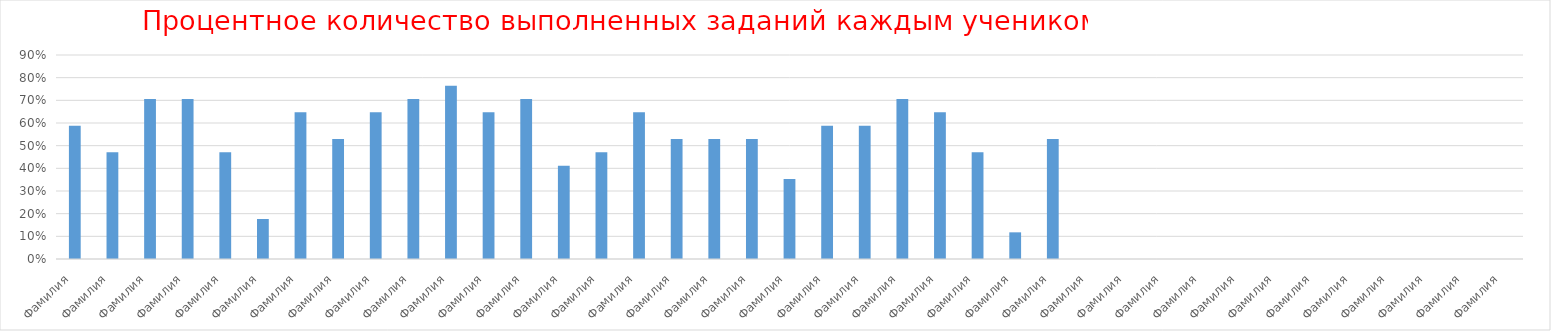
| Category | Series 0 |
|---|---|
| Фамилия  | 0.588 |
| Фамилия  | 0.471 |
| Фамилия  | 0.706 |
| Фамилия  | 0.706 |
| Фамилия  | 0.471 |
| Фамилия  | 0.176 |
| Фамилия  | 0.647 |
| Фамилия  | 0.529 |
| Фамилия  | 0.647 |
| Фамилия  | 0.706 |
| Фамилия  | 0.765 |
| Фамилия  | 0.647 |
| Фамилия  | 0.706 |
| Фамилия  | 0.412 |
| Фамилия  | 0.471 |
| Фамилия  | 0.647 |
| Фамилия  | 0.529 |
| Фамилия  | 0.529 |
| Фамилия  | 0.529 |
| Фамилия  | 0.353 |
| Фамилия  | 0.588 |
| Фамилия  | 0.588 |
| Фамилия  | 0.706 |
| Фамилия  | 0.647 |
| Фамилия  | 0.471 |
| Фамилия  | 0.118 |
| Фамилия  | 0.529 |
| Фамилия  | 0 |
| Фамилия  | 0 |
| Фамилия  | 0 |
| Фамилия  | 0 |
| Фамилия  | 0 |
| Фамилия  | 0 |
| Фамилия  | 0 |
| Фамилия  | 0 |
| Фамилия  | 0 |
| Фамилия  | 0 |
| Фамилия  | 0 |
| Фамилия  | 0 |